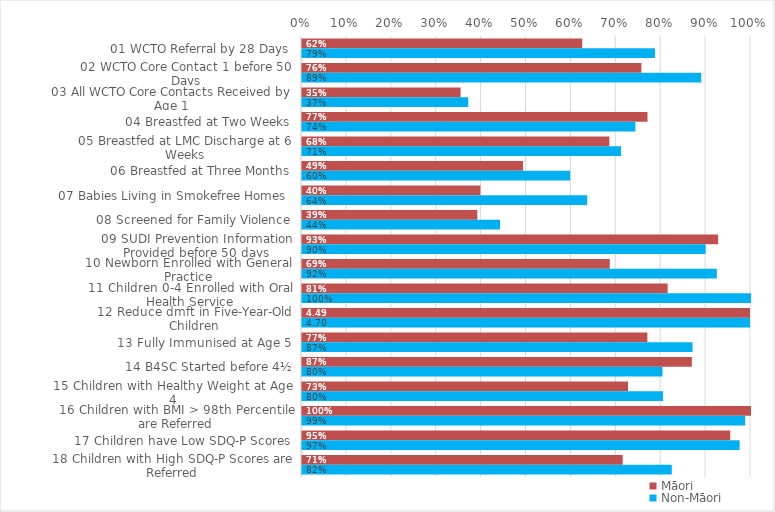
| Category | Māori | Non-Māori |
|---|---|---|
| 01 WCTO Referral by 28 Days | 0.624 | 0.786 |
| 02 WCTO Core Contact 1 before 50 Days | 0.756 | 0.889 |
| 03 All WCTO Core Contacts Received by Age 1 | 0.353 | 0.37 |
| 04 Breastfed at Two Weeks | 0.77 | 0.743 |
| 05 Breastfed at LMC Discharge at 6 Weeks | 0.685 | 0.711 |
| 06 Breastfed at Three Months | 0.492 | 0.597 |
| 07 Babies Living in Smokefree Homes  | 0.397 | 0.635 |
| 08 Screened for Family Violence | 0.39 | 0.441 |
| 09 SUDI Prevention Information Provided before 50 days | 0.927 | 0.899 |
| 10 Newborn Enrolled with General Practice | 0.685 | 0.924 |
| 11 Children 0-4 Enrolled with Oral Health Service | 0.814 | 1 |
| 12 Reduce dmft in Five-Year-Old Children | 4.491 | 4.699 |
| 13 Fully Immunised at Age 5 | 0.769 | 0.87 |
| 14 B4SC Started before 4½ | 0.868 | 0.803 |
| 15 Children with Healthy Weight at Age 4 | 0.726 | 0.804 |
| 16 Children with BMI > 98th Percentile are Referred | 1 | 0.987 |
| 17 Children have Low SDQ-P Scores | 0.954 | 0.975 |
| 18 Children with High SDQ-P Scores are Referred | 0.714 | 0.824 |